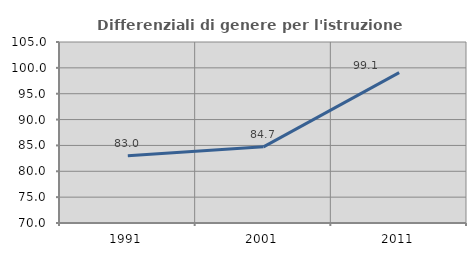
| Category | Differenziali di genere per l'istruzione superiore |
|---|---|
| 1991.0 | 83.008 |
| 2001.0 | 84.724 |
| 2011.0 | 99.066 |